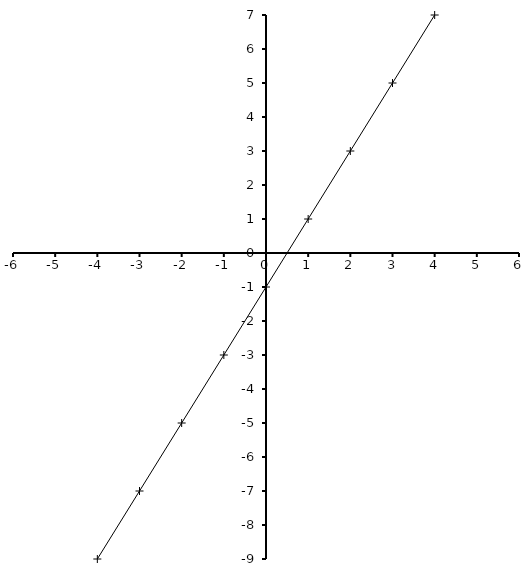
| Category | Series 0 |
|---|---|
| -4.0 | -9 |
| -3.0 | -7 |
| -2.0 | -5 |
| -1.0 | -3 |
| 0.0 | -1 |
| 1.0 | 1 |
| 2.0 | 3 |
| 3.0 | 5 |
| 4.0 | 7 |